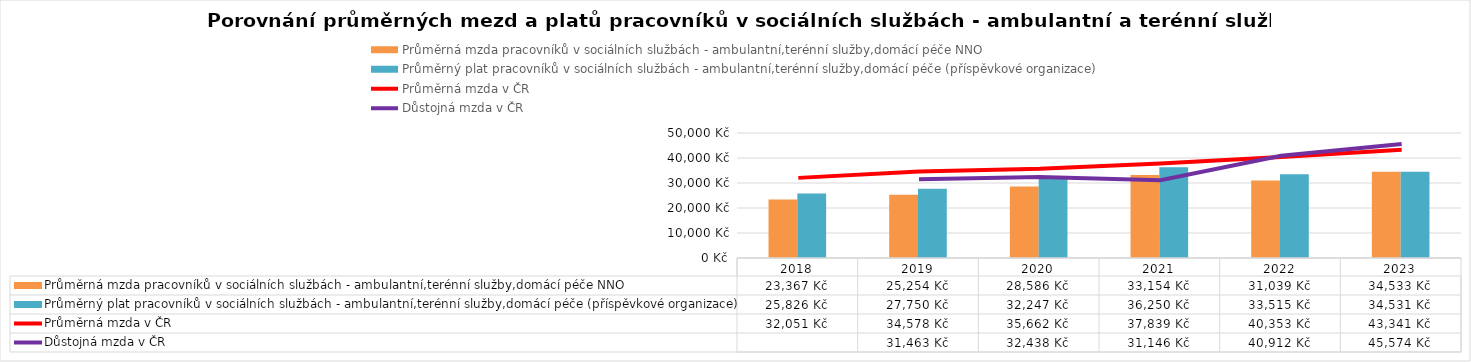
| Category | Průměrná mzda pracovníků v sociálních službách - ambulantní,terénní služby,domácí péče NNO | Průměrný plat pracovníků v sociálních službách - ambulantní,terénní služby,domácí péče (příspěvkové organizace) |
|---|---|---|
| 2018.0 | 23366.647 | 25826.245 |
| 2019.0 | 25254 | 27750 |
| 2020.0 | 28586 | 32247 |
| 2021.0 | 33154.379 | 36250.13 |
| 2022.0 | 31039 | 33514.553 |
| 2023.0 | 34533 | 34531 |